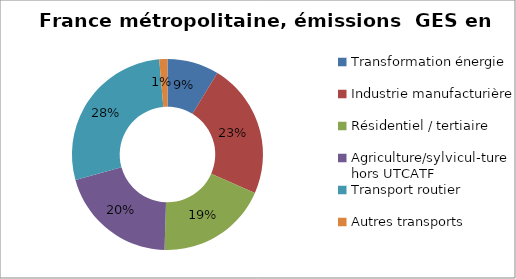
| Category | 2014 |
|---|---|
| Transformation énergie | 39.032 |
| Industrie manufacturière | 101.927 |
| Résidentiel / tertiaire | 84.31 |
| Agriculture/sylvicul-ture hors UTCATF  | 90.223 |
| Transport routier | 124.463 |
| Autres transports  | 6.179 |